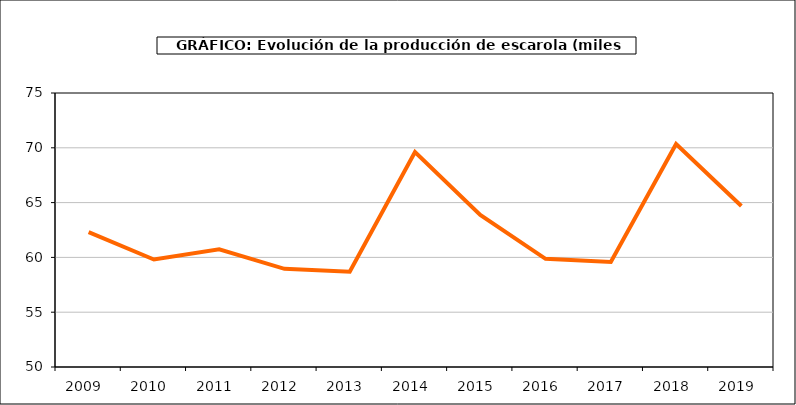
| Category | producción |
|---|---|
| 2009.0 | 62.3 |
| 2010.0 | 59.803 |
| 2011.0 | 60.737 |
| 2012.0 | 58.957 |
| 2013.0 | 58.687 |
| 2014.0 | 69.619 |
| 2015.0 | 63.882 |
| 2016.0 | 59.873 |
| 2017.0 | 59.587 |
| 2018.0 | 70.347 |
| 2019.0 | 64.693 |